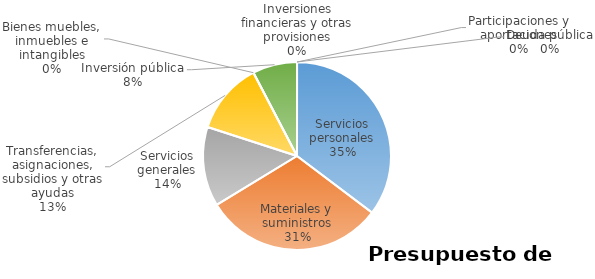
| Category | Series 0 | Series 1 | Series 2 | Series 3 | Series 4 | Series 5 |
|---|---|---|---|---|---|---|
| Servicios personales | 20761484 |  |  |  |  |  |
| Materiales y suministros | 18250096 |  |  |  |  |  |
| Servicios generales | 8052388 |  |  |  |  |  |
| Transferencias, asignaciones, subsidios y otras ayudas | 7261296 |  |  |  |  |  |
| Bienes muebles, inmuebles e intangibles | 0 |  |  |  |  |  |
| Inversión pública | 4514712 |  |  |  |  |  |
| Inversiones financieras y otras provisiones | 0 |  |  |  |  |  |
| Participaciones y aportaciones | 0 |  |  |  |  |  |
| Deuda pública | 0 |  |  |  |  |  |